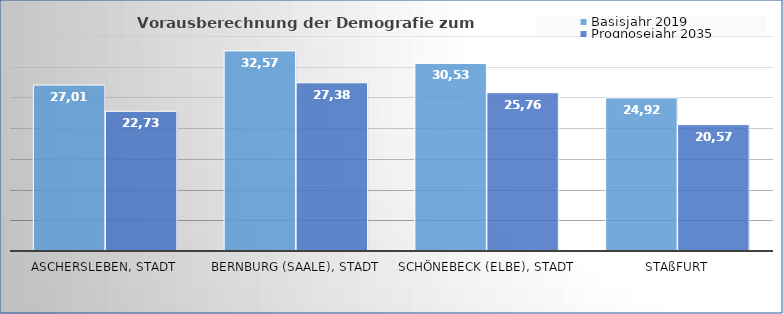
| Category | Basisjahr 2019 | Prognosejahr 2035 |
|---|---|---|
| Aschersleben, Stadt | 27012 | 22738 |
| Bernburg (Saale), Stadt | 32573 | 27381 |
| Schönebeck (Elbe), Stadt | 30532 | 25768 |
| Staßfurt | 24923 | 20574 |